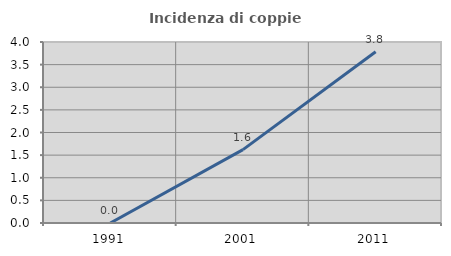
| Category | Incidenza di coppie miste |
|---|---|
| 1991.0 | 0 |
| 2001.0 | 1.622 |
| 2011.0 | 3.784 |